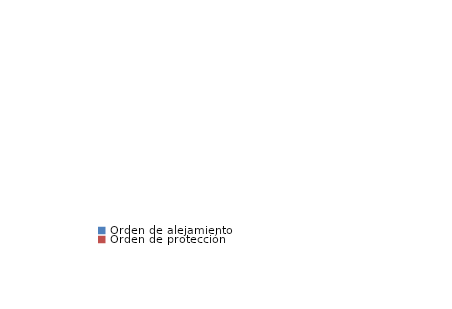
| Category | Series 0 |
|---|---|
| Orden de alejamiento | 0 |
| Orden de protección | 0 |